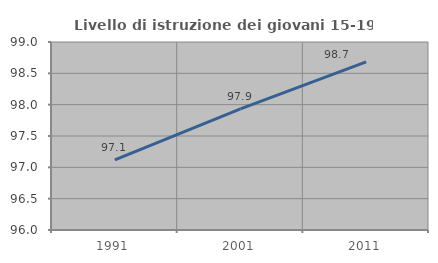
| Category | Livello di istruzione dei giovani 15-19 anni |
|---|---|
| 1991.0 | 97.12 |
| 2001.0 | 97.934 |
| 2011.0 | 98.684 |